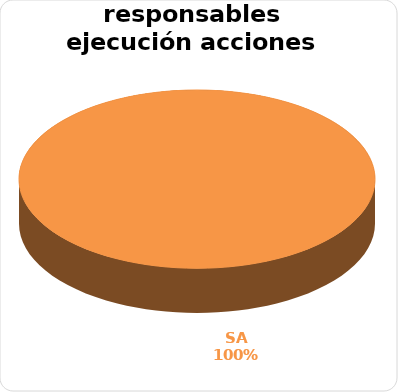
| Category | Series 0 |
|---|---|
| SA | 2 |